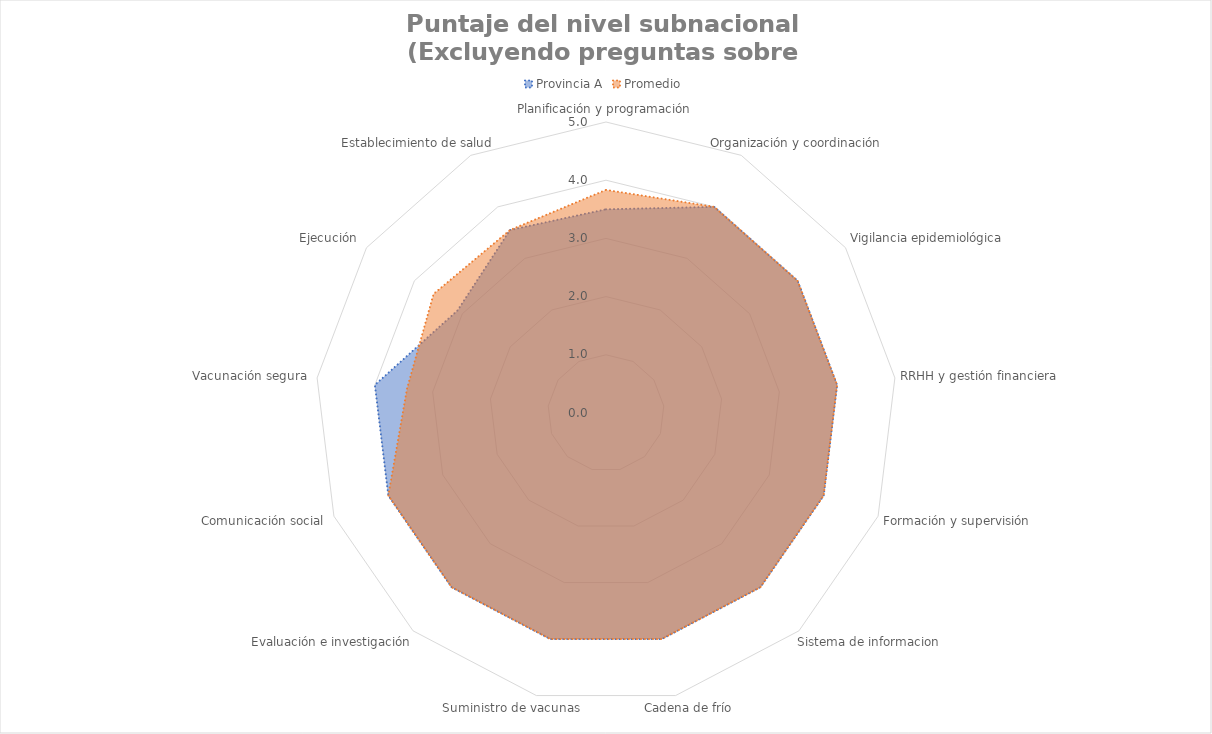
| Category | Provincia A | Promedio |
|---|---|---|
| Planificación y programación | 3.5 | 3.833 |
| Organización y coordinación | 4 | 4 |
| Vigilancia epidemiológica | 4 | 4 |
| RRHH y gestión financiera | 4 | 4 |
| Formación y supervisión | 4 | 4 |
| Sistema de informacion | 4 | 4 |
| Cadena de frío | 4 | 4 |
| Suministro de vacunas | 4 | 4 |
| Evaluación e investigación | 4 | 4 |
| Comunicación social | 4 | 4 |
| Vacunación segura | 4 | 3.444 |
| Ejecución | 3.1 | 3.6 |
| Establecimiento de salud | 3.55 | 3.55 |